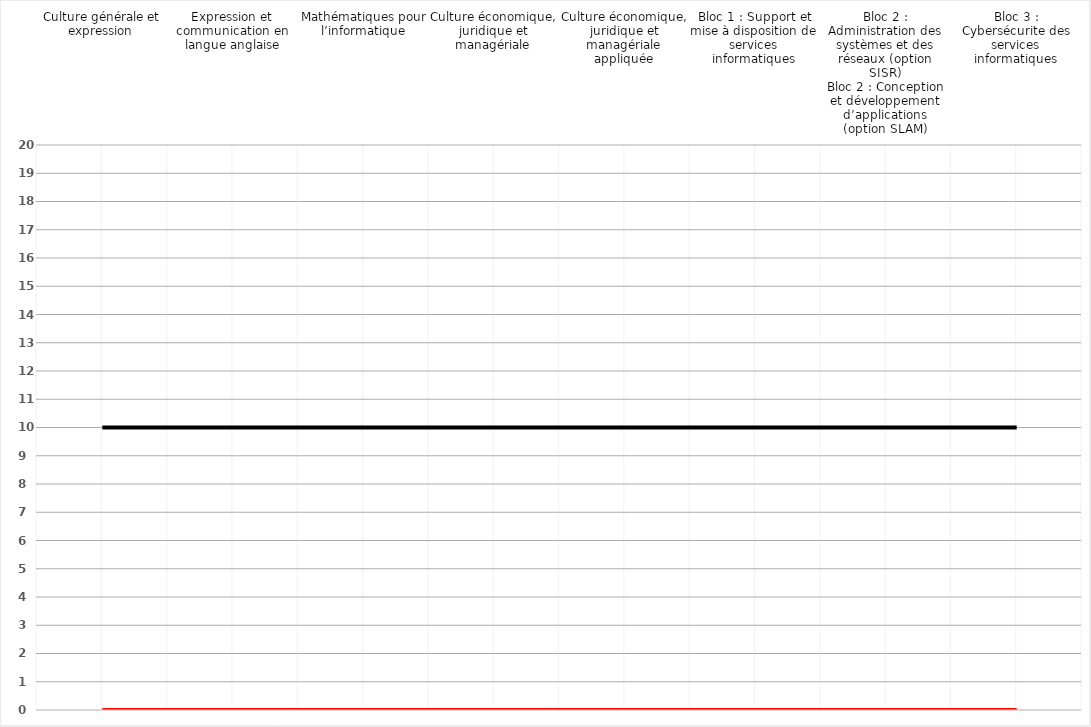
| Category | Series 0 | Series 1 | Series 2 | Series 3 | Series 4 |
|---|---|---|---|---|---|
| Culture générale et expression |  |  |  | 0 | 10 |
| Expression et communication en langue anglaise |  |  |  | 0 | 10 |
| Mathématiques pour l’informatique |  |  |  | 0 | 10 |
| Culture économique, juridique et managériale |  |  |  | 0 | 10 |
| Culture économique, juridique et managériale appliquée |  |  |  | 0 | 10 |
| Bloc 1 : Support et mise à disposition de services informatiques |  |  |  | 0 | 10 |
| Bloc 2 : Administration des systèmes et des réseaux (option SISR)
Bloc 2 : Conception et développement d’applications (option SLAM) |  |  |  | 0 | 10 |
| Bloc 3 : Cybersécurite des services informatiques |  |  |  | 0 | 10 |